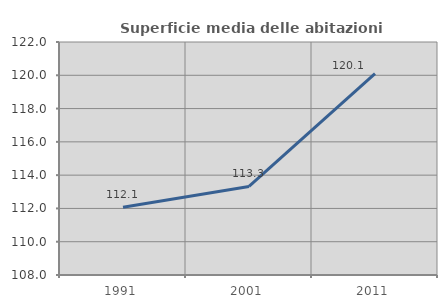
| Category | Superficie media delle abitazioni occupate |
|---|---|
| 1991.0 | 112.073 |
| 2001.0 | 113.321 |
| 2011.0 | 120.105 |